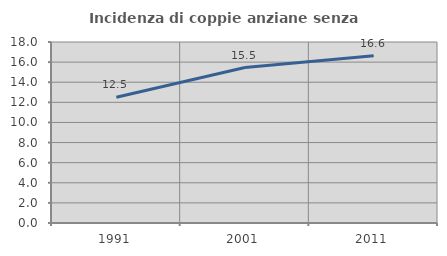
| Category | Incidenza di coppie anziane senza figli  |
|---|---|
| 1991.0 | 12.514 |
| 2001.0 | 15.464 |
| 2011.0 | 16.626 |